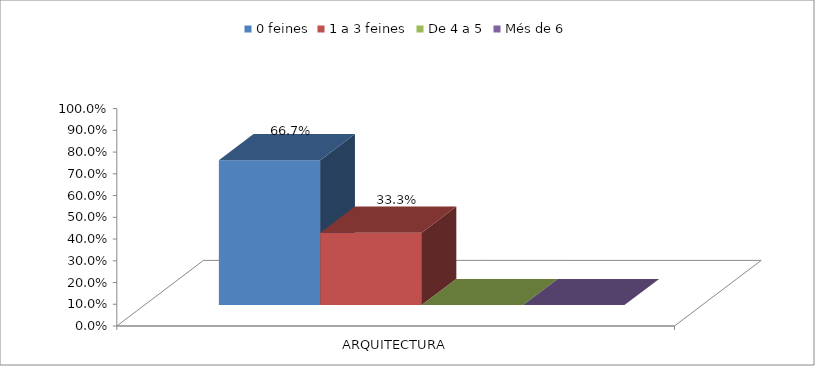
| Category | 0 feines | 1 a 3 feines | De 4 a 5 | Més de 6 |
|---|---|---|---|---|
| ARQUITECTURA | 0.667 | 0.333 | 0 | 0 |